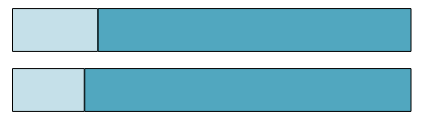
| Category | Series 0 | Series 1 |
|---|---|---|
| 0 | 3468 | 15682 |
| 1 | 4787 | 17517 |